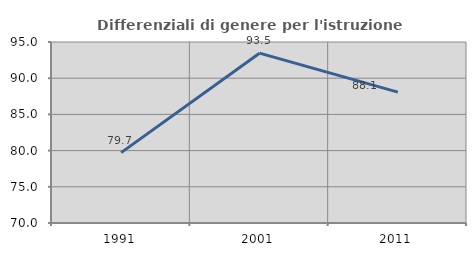
| Category | Differenziali di genere per l'istruzione superiore |
|---|---|
| 1991.0 | 79.722 |
| 2001.0 | 93.458 |
| 2011.0 | 88.082 |